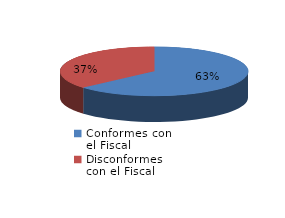
| Category | Series 0 |
|---|---|
| 0 | 106 |
| 1 | 61 |